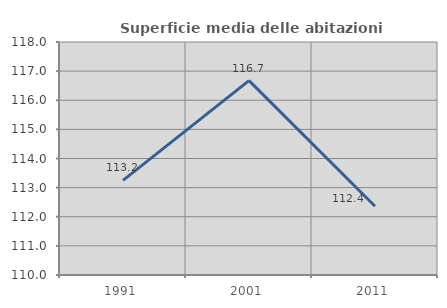
| Category | Superficie media delle abitazioni occupate |
|---|---|
| 1991.0 | 113.248 |
| 2001.0 | 116.674 |
| 2011.0 | 112.359 |